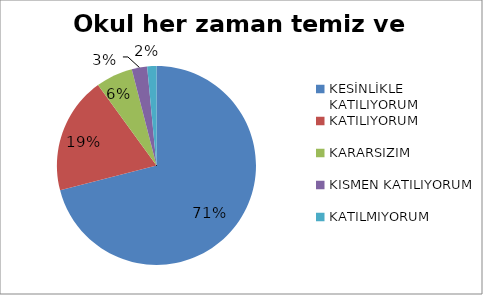
| Category | Okul her zaman temiz ve bakımlıdır. |
|---|---|
| KESİNLİKLE KATILIYORUM | 142 |
| KATILIYORUM | 38 |
| KARARSIZIM | 12 |
| KISMEN KATILIYORUM | 5 |
| KATILMIYORUM | 3 |